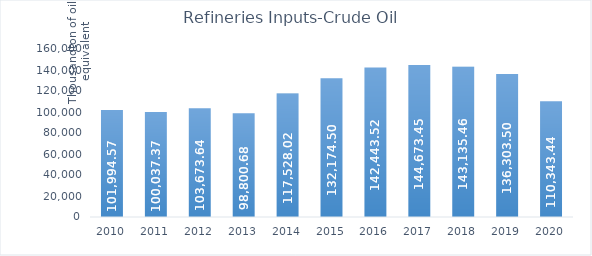
| Category | Refineries Inputs-Crude Oil* |
|---|---|
| 2010.0 | 101994.57 |
| 2011.0 | 100037.37 |
| 2012.0 | 103673.64 |
| 2013.0 | 98800.68 |
| 2014.0 | 117528.02 |
| 2015.0 | 132174.5 |
| 2016.0 | 142443.52 |
| 2017.0 | 144673.45 |
| 2018.0 | 143135.46 |
| 2019.0 | 136303.5 |
| 2020.0 | 110343.44 |